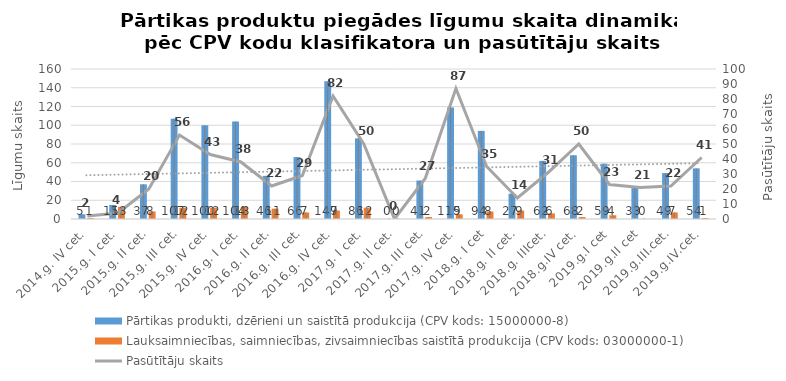
| Category | Pārtikas produkti, dzērieni un saistītā produkcija (CPV kods: 15000000-8) | Lauksaimniecības, saimniecības, zivsaimniecības saistītā produkcija (CPV kods: 03000000-1) |
|---|---|---|
| 2014.g. IV cet. | 5 | 1 |
| 2015.g. I cet. | 15 | 13 |
| 2015.g. II cet. | 37 | 8 |
| 2015.g. III cet. | 107 | 12 |
| 2015.g. IV cet. | 100 | 12 |
| 2016.g. I cet. | 104 | 13 |
| 2016.g. II cet. | 46 | 11 |
| 2016.g. III cet. | 66 | 7 |
| 2016.g. IV cet. | 147 | 9 |
| 2017.g. I cet. | 86 | 12 |
| 2017.g. II cet. | 0 | 0 |
| 2017.g. III cet. | 41 | 2 |
| 2017.g. IV cet. | 119 | 5 |
| 2018.g. I cet | 94 | 8 |
| 2018.g. II cet. | 27 | 9 |
| 2018.g. IIIcet. | 62 | 6 |
| 2018.g.IV cet. | 68 | 2 |
| 2019.g.I cet | 59 | 4 |
| 2019.g.II cet | 33 | 0 |
| 2019.g.III.cet. | 49 | 7 |
| 2019.g.IV.cet. | 54 | 1 |